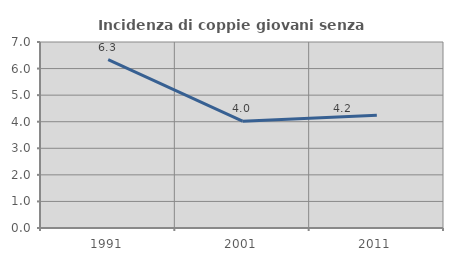
| Category | Incidenza di coppie giovani senza figli |
|---|---|
| 1991.0 | 6.338 |
| 2001.0 | 4.019 |
| 2011.0 | 4.245 |